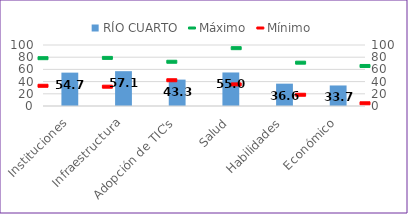
| Category | RÍO CUARTO |
|---|---|
| Instituciones | 54.707 |
| Infraestructura | 57.077 |
| Adopción de TIC's | 43.255 |
| Salud | 54.969 |
| Habilidades | 36.619 |
| Económico | 33.659 |